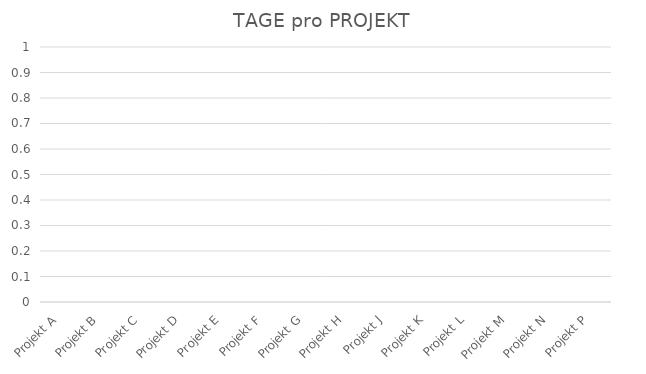
| Category | ANZAHL DER TAGE |
|---|---|
| Projekt A | 0 |
| Projekt B | 0 |
| Projekt C | 0 |
| Projekt D | 0 |
| Projekt E | 0 |
| Projekt F | 0 |
| Projekt G | 0 |
| Projekt H | 0 |
| Projekt J | 0 |
| Projekt K | 0 |
| Projekt L | 0 |
| Projekt M | 0 |
| Projekt N | 0 |
| Projekt P | 0 |